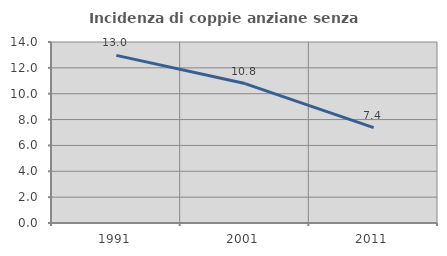
| Category | Incidenza di coppie anziane senza figli  |
|---|---|
| 1991.0 | 12.963 |
| 2001.0 | 10.784 |
| 2011.0 | 7.383 |